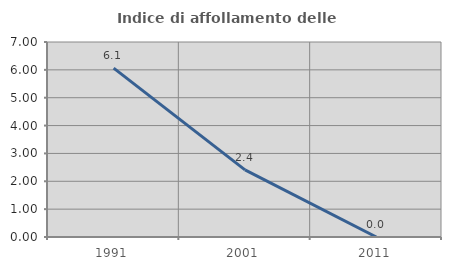
| Category | Indice di affollamento delle abitazioni  |
|---|---|
| 1991.0 | 6.061 |
| 2001.0 | 2.41 |
| 2011.0 | 0 |